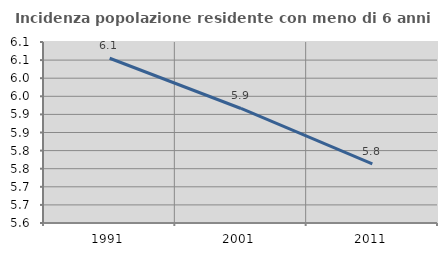
| Category | Incidenza popolazione residente con meno di 6 anni |
|---|---|
| 1991.0 | 6.055 |
| 2001.0 | 5.916 |
| 2011.0 | 5.764 |